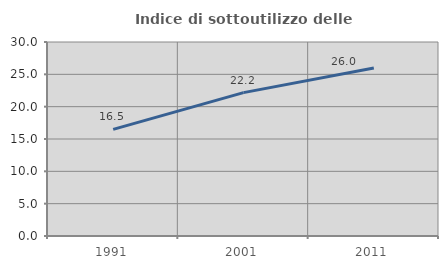
| Category | Indice di sottoutilizzo delle abitazioni  |
|---|---|
| 1991.0 | 16.497 |
| 2001.0 | 22.171 |
| 2011.0 | 25.965 |